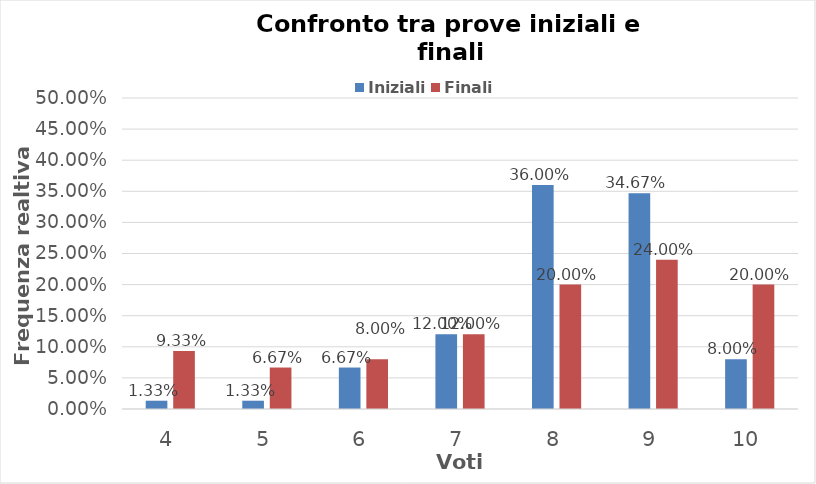
| Category | Iniziali | Finali |
|---|---|---|
| 4.0 | 0.013 | 0.093 |
| 5.0 | 0.013 | 0.067 |
| 6.0 | 0.067 | 0.08 |
| 7.0 | 0.12 | 0.12 |
| 8.0 | 0.36 | 0.2 |
| 9.0 | 0.347 | 0.24 |
| 10.0 | 0.08 | 0.2 |